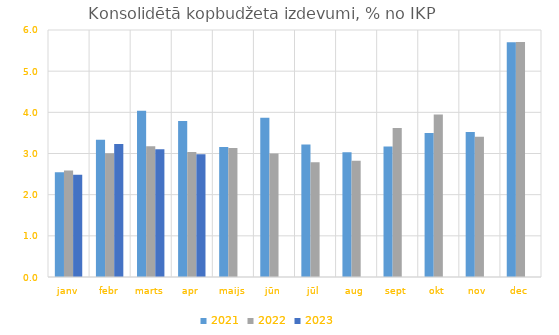
| Category | 2021 | 2022 | 2023 |
|---|---|---|---|
| janv | 2.547 | 2.589 | 2.485 |
| febr | 3.335 | 3.006 | 3.233 |
| marts | 4.036 | 3.178 | 3.101 |
| apr | 3.792 | 3.038 | 2.981 |
| maijs | 3.157 | 3.132 | 0 |
| jūn | 3.87 | 2.999 | 0 |
| jūl | 3.221 | 2.786 | 0 |
| aug | 3.029 | 2.827 | 0 |
| sept | 3.169 | 3.617 | 0 |
| okt | 3.495 | 3.95 | 0 |
| nov | 3.519 | 3.407 | 0 |
| dec | 5.703 | 5.708 | 0 |